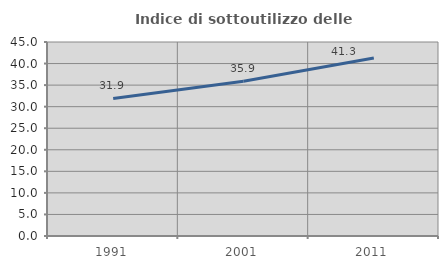
| Category | Indice di sottoutilizzo delle abitazioni  |
|---|---|
| 1991.0 | 31.91 |
| 2001.0 | 35.874 |
| 2011.0 | 41.267 |